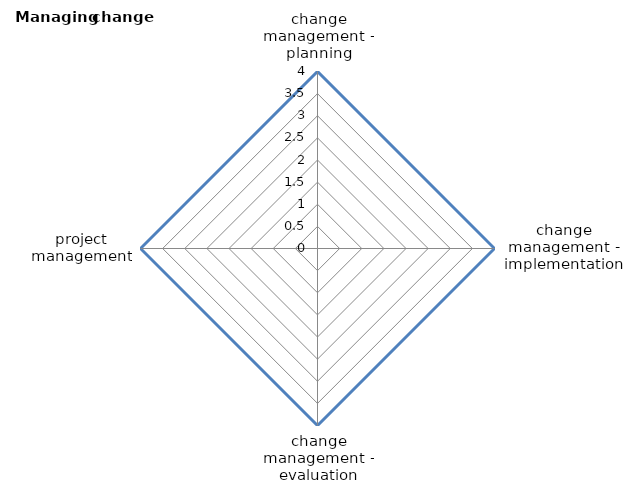
| Category | Series 0 | Series 1 |
|---|---|---|
| change management - planning | 4 | 0 |
| change management - implementation | 4 | 0 |
| change management - evaluation | 4 | 0 |
| project management | 4 | 0 |